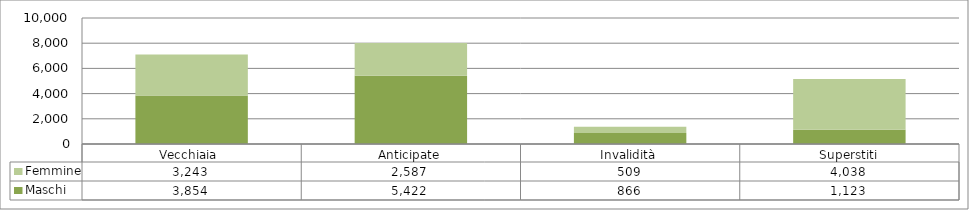
| Category | Maschi | Femmine |
|---|---|---|
| Vecchiaia  | 3854 | 3243 |
| Anticipate | 5422 | 2587 |
| Invalidità | 866 | 509 |
| Superstiti | 1123 | 4038 |